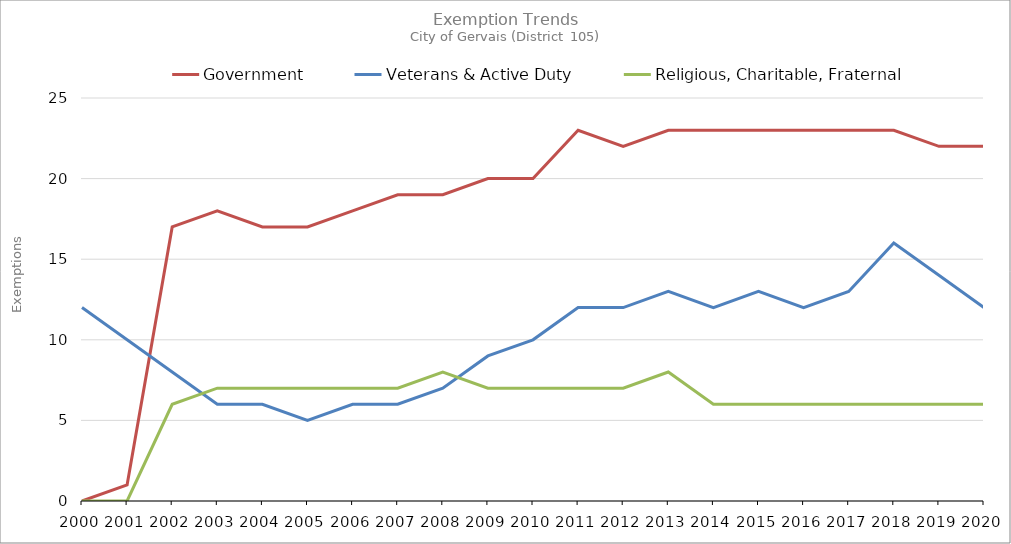
| Category | Government | Veterans & Active Duty | Religious, Charitable, Fraternal |
|---|---|---|---|
| 2000.0 | 0 | 12 | 0 |
| 2001.0 | 1 | 10 | 0 |
| 2002.0 | 17 | 8 | 6 |
| 2003.0 | 18 | 6 | 7 |
| 2004.0 | 17 | 6 | 7 |
| 2005.0 | 17 | 5 | 7 |
| 2006.0 | 18 | 6 | 7 |
| 2007.0 | 19 | 6 | 7 |
| 2008.0 | 19 | 7 | 8 |
| 2009.0 | 20 | 9 | 7 |
| 2010.0 | 20 | 10 | 7 |
| 2011.0 | 23 | 12 | 7 |
| 2012.0 | 22 | 12 | 7 |
| 2013.0 | 23 | 13 | 8 |
| 2014.0 | 23 | 12 | 6 |
| 2015.0 | 23 | 13 | 6 |
| 2016.0 | 23 | 12 | 6 |
| 2017.0 | 23 | 13 | 6 |
| 2018.0 | 23 | 16 | 6 |
| 2019.0 | 22 | 14 | 6 |
| 2020.0 | 22 | 12 | 6 |